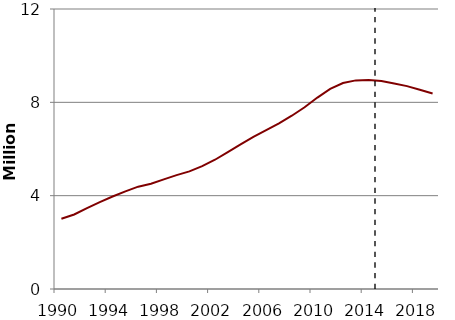
| Category | SSDI beneficiaries  |
|---|---|
| 1990.0 | 3011294 |
| 1991.0 | 3194938 |
| 1992.0 | 3467783 |
| 1993.0 | 3725966 |
| 1994.0 | 3962954 |
| 1995.0 | 4185263 |
| 1996.0 | 4385623 |
| 1997.0 | 4508134 |
| 1998.0 | 4698319 |
| 1999.0 | 4879455 |
| 2000.0 | 5042333 |
| 2001.0 | 5268039 |
| 2002.0 | 5539597 |
| 2003.0 | 5868541 |
| 2004.0 | 6197385 |
| 2005.0 | 6519001 |
| 2006.0 | 6806918 |
| 2007.0 | 7098723 |
| 2008.0 | 7426691 |
| 2009.0 | 7788013 |
| 2010.0 | 8203951 |
| 2011.0 | 8575544 |
| 2012.0 | 8826591 |
| 2013.0 | 8940950 |
| 2014.0 | 8954518 |
| 2015.0 | 8909430 |
| 2016.0 | 8808736 |
| 2017.0 | 8695475 |
| 2018.0 | 8537332 |
| 2019.0 | 8378374 |